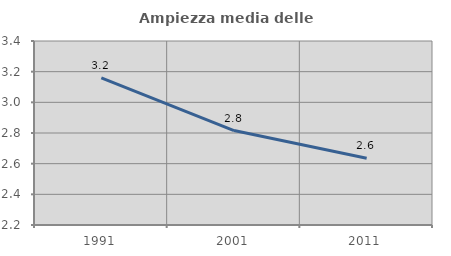
| Category | Ampiezza media delle famiglie |
|---|---|
| 1991.0 | 3.159 |
| 2001.0 | 2.816 |
| 2011.0 | 2.635 |